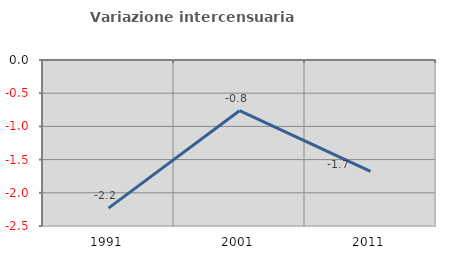
| Category | Variazione intercensuaria annua |
|---|---|
| 1991.0 | -2.231 |
| 2001.0 | -0.764 |
| 2011.0 | -1.677 |